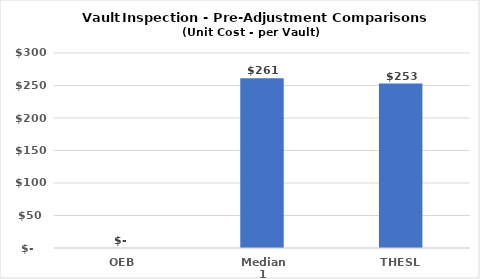
| Category | Series 0 |
|---|---|
| OEB | 0 |
| Median 1 | 261.002 |
| THESL | 253 |